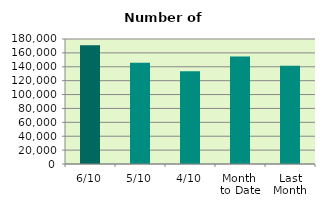
| Category | Series 0 |
|---|---|
| 6/10 | 171018 |
| 5/10 | 145924 |
| 4/10 | 133482 |
| Month 
to Date | 154718.5 |
| Last
Month | 141428.727 |